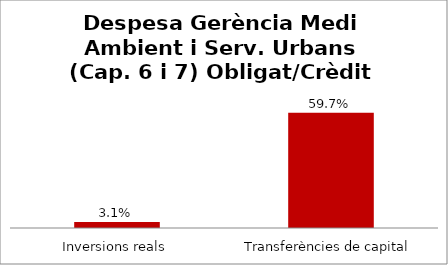
| Category | Series 0 |
|---|---|
| Inversions reals | 0.031 |
| Transferències de capital | 0.597 |